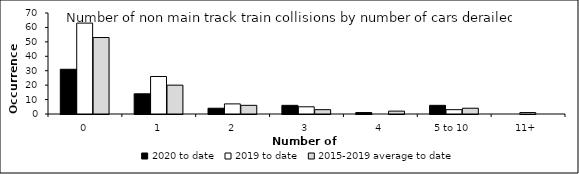
| Category | 2020 to date | 2019 to date | 2015-2019 average to date |
|---|---|---|---|
| 0 | 31 | 63 | 53 |
| 1 | 14 | 26 | 20 |
| 2 | 4 | 7 | 6 |
| 3 | 6 | 5 | 3 |
| 4 | 1 | 0 | 2 |
| 5 to 10 | 6 | 3 | 4 |
| 11+ | 0 | 1 | 0 |